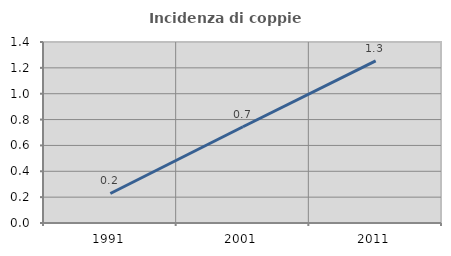
| Category | Incidenza di coppie miste |
|---|---|
| 1991.0 | 0.228 |
| 2001.0 | 0.744 |
| 2011.0 | 1.254 |